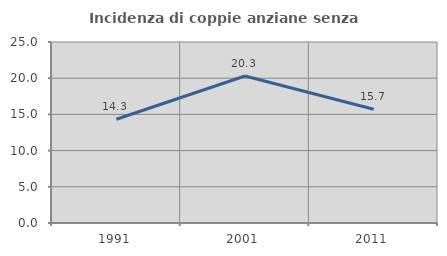
| Category | Incidenza di coppie anziane senza figli  |
|---|---|
| 1991.0 | 14.331 |
| 2001.0 | 20.308 |
| 2011.0 | 15.714 |